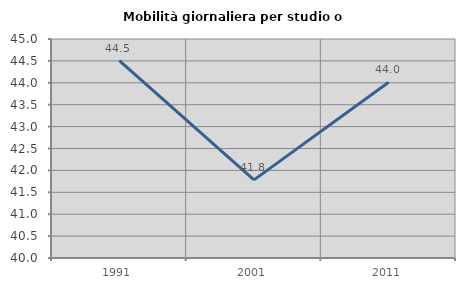
| Category | Mobilità giornaliera per studio o lavoro |
|---|---|
| 1991.0 | 44.507 |
| 2001.0 | 41.784 |
| 2011.0 | 44.014 |